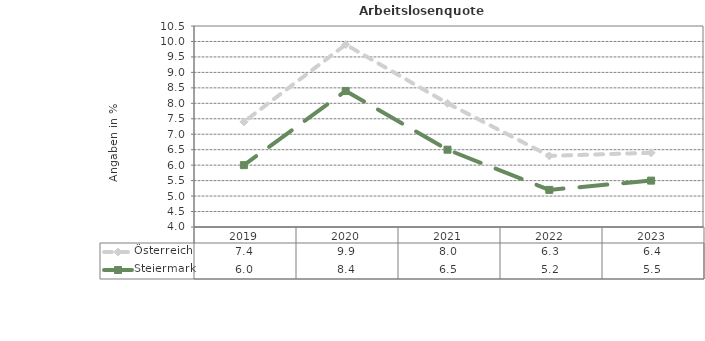
| Category | Österreich | Steiermark |
|---|---|---|
| 2023.0 | 6.4 | 5.5 |
| 2022.0 | 6.3 | 5.2 |
| 2021.0 | 8 | 6.5 |
| 2020.0 | 9.9 | 8.4 |
| 2019.0 | 7.4 | 6 |